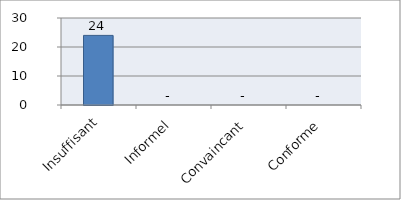
| Category | Series 0 |
|---|---|
| Insuffisant | 24 |
| Informel | 0 |
| Convaincant | 0 |
| Conforme | 0 |